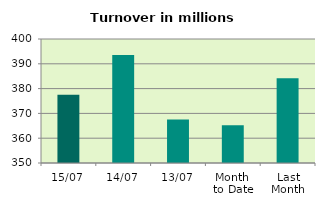
| Category | Series 0 |
|---|---|
| 15/07 | 377.472 |
| 14/07 | 393.55 |
| 13/07 | 367.531 |
| Month 
to Date | 365.222 |
| Last
Month | 384.158 |